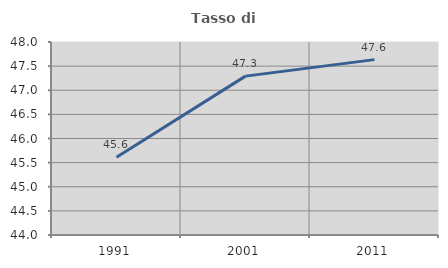
| Category | Tasso di occupazione   |
|---|---|
| 1991.0 | 45.61 |
| 2001.0 | 47.293 |
| 2011.0 | 47.635 |